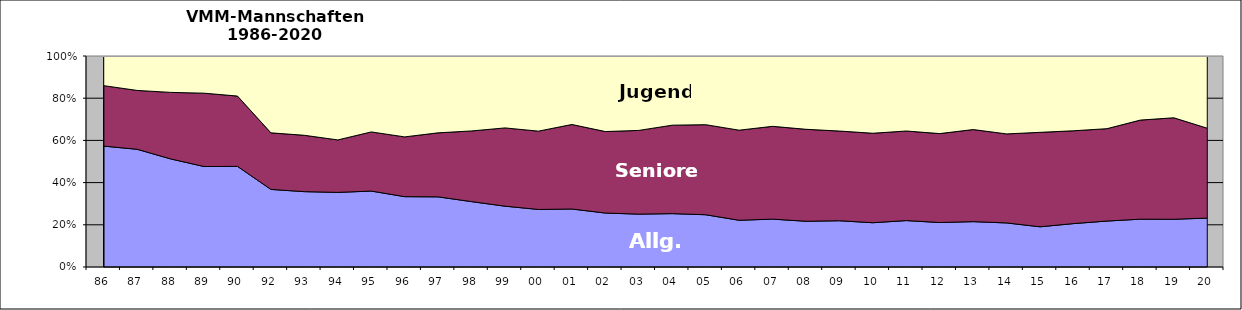
| Category | Allg. Klasse | Senioren | Jugend |
|---|---|---|---|
| 86.0 | 106 | 53 | 26 |
| 87.0 | 106 | 53 | 31 |
| 88.0 | 104 | 64 | 35 |
| 89.0 | 100 | 73 | 37 |
| 90.0 | 103 | 72 | 41 |
| 92.0 | 107 | 78 | 106 |
| 93.0 | 115 | 86 | 121 |
| 94.0 | 128 | 90 | 144 |
| 95.0 | 122 | 95 | 122 |
| 96.0 | 120 | 102 | 138 |
| 97.0 | 126 | 115 | 138 |
| 98.0 | 123 | 133 | 141 |
| 99.0 | 115 | 148 | 136 |
| 0.0 | 108 | 147 | 141 |
| 1.0 | 105 | 153 | 124 |
| 2.0 | 100 | 151 | 140 |
| 3.0 | 108 | 171 | 152 |
| 4.0 | 108 | 179 | 140 |
| 5.0 | 105 | 181 | 138 |
| 6.0 | 97 | 187 | 154 |
| 7.0 | 96 | 186 | 141 |
| 8.0 | 93 | 187 | 149 |
| 9.0 | 98 | 190 | 159 |
| 10.0 | 94 | 190 | 164 |
| 11.0 | 99 | 191 | 160 |
| 12.0 | 98 | 196 | 171 |
| 13.0 | 98 | 199 | 159 |
| 14.0 | 95 | 192 | 168 |
| 15.0 | 89 | 209 | 169 |
| 16.0 | 94 | 201 | 162 |
| 17.0 | 98 | 197 | 155 |
| 18.0 | 97 | 201 | 130 |
| 19.0 | 95 | 202 | 123 |
| 20.0 | 86 | 158 | 127 |